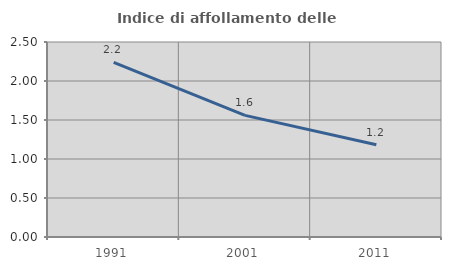
| Category | Indice di affollamento delle abitazioni  |
|---|---|
| 1991.0 | 2.239 |
| 2001.0 | 1.56 |
| 2011.0 | 1.183 |